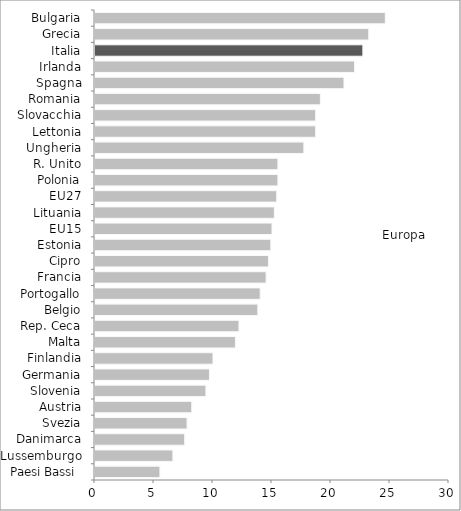
| Category | Series 0 |
|---|---|
| Paesi Bassi  | 5.5 |
| Lussemburgo | 6.6 |
| Danimarca | 7.6 |
| Svezia | 7.8 |
| Austria | 8.2 |
| Slovenia | 9.4 |
| Germania | 9.7 |
| Finlandia | 10 |
| Malta | 11.9 |
| Rep. Ceca | 12.2 |
| Belgio | 13.8 |
| Portogallo | 14 |
| Francia | 14.5 |
| Cipro | 14.7 |
| Estonia | 14.9 |
| EU15 | 15 |
| Lituania | 15.2 |
| EU27 | 15.4 |
| Polonia | 15.5 |
| R. Unito | 15.5 |
| Ungheria | 17.7 |
| Lettonia | 18.7 |
| Slovacchia | 18.7 |
| Romania | 19.1 |
| Spagna | 21.1 |
| Irlanda | 22 |
| Italia | 22.7 |
| Grecia | 23.2 |
| Bulgaria | 24.6 |